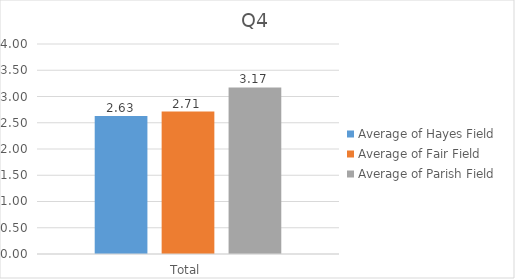
| Category | Average of Hayes Field | Average of Fair Field | Average of Parish Field |
|---|---|---|---|
| Total | 2.631 | 2.712 | 3.172 |